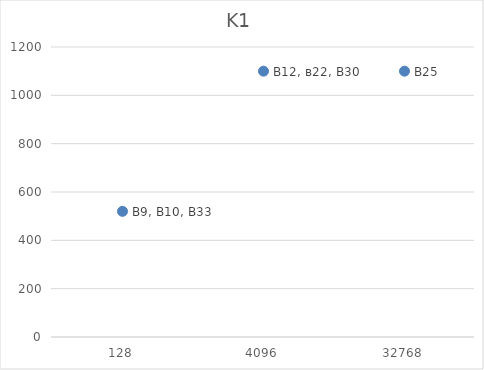
| Category | K1 |
|---|---|
| 128.0 | 520 |
| 4096.0 | 1100 |
| 32768.0 | 1100 |